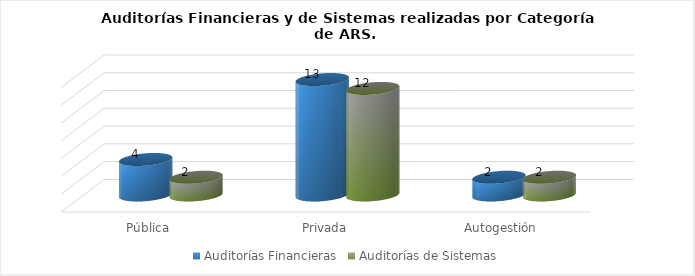
| Category | Auditorías Financieras | Auditorías de Sistemas |
|---|---|---|
| Pública | 4 | 2 |
| Privada | 13 | 12 |
| Autogestión | 2 | 2 |